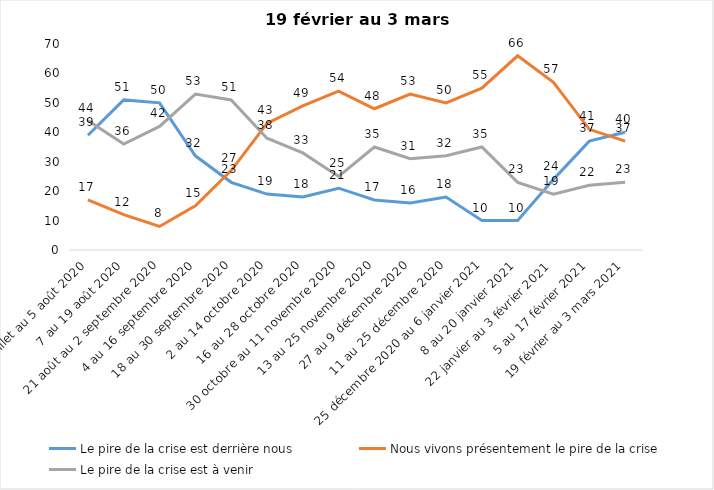
| Category | Le pire de la crise est derrière nous | Nous vivons présentement le pire de la crise | Le pire de la crise est à venir |
|---|---|---|---|
| 24 juillet au 5 août 2020 | 39 | 17 | 44 |
| 7 au 19 août 2020 | 51 | 12 | 36 |
| 21 août au 2 septembre 2020 | 50 | 8 | 42 |
| 4 au 16 septembre 2020 | 32 | 15 | 53 |
| 18 au 30 septembre 2020 | 23 | 27 | 51 |
| 2 au 14 octobre 2020 | 19 | 43 | 38 |
| 16 au 28 octobre 2020 | 18 | 49 | 33 |
| 30 octobre au 11 novembre 2020 | 21 | 54 | 25 |
| 13 au 25 novembre 2020 | 17 | 48 | 35 |
| 27 au 9 décembre 2020 | 16 | 53 | 31 |
| 11 au 25 décembre 2020 | 18 | 50 | 32 |
| 25 décembre 2020 au 6 janvier 2021 | 10 | 55 | 35 |
| 8 au 20 janvier 2021 | 10 | 66 | 23 |
| 22 janvier au 3 février 2021 | 24 | 57 | 19 |
| 5 au 17 février 2021 | 37 | 41 | 22 |
| 19 février au 3 mars 2021 | 40 | 37 | 23 |